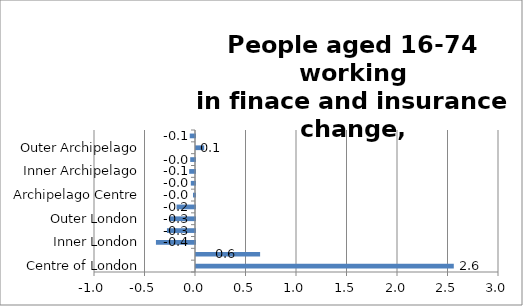
| Category | Series 0 |
|---|---|
| Centre of London | 2.552 |
| London Core | 0.635 |
| Inner London | -0.387 |
| London Suburbs | -0.278 |
| Outer London | -0.256 |
| London Edge | -0.183 |
| Archipelago Centre | -0.02 |
| Archipelago Core | -0.042 |
| Inner Archipelago | -0.058 |
| Archipelago Suburbs | -0.047 |
| Outer Archipelago | 0.081 |
| Archipelago Edge | -0.052 |